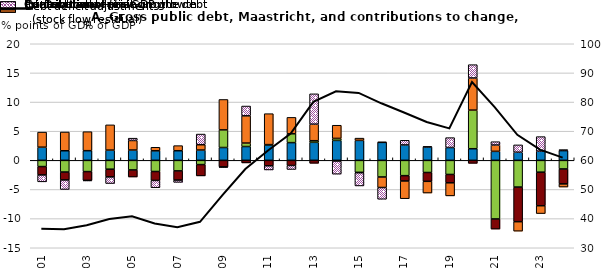
| Category | Interest cost of financing the debt | Contribution of real GDP growth | Contribution of price growth | Primary fiscal deficit | Debt deficit adjustment (stock flow residual) |
|---|---|---|---|---|---|
| 2001-01-01 | 2.254 | -1.07 | -1.44 | 2.589 | -1.182 |
| 2002-01-01 | 1.64 | -2.014 | -1.354 | 3.222 | -1.635 |
| 2003-01-01 | 1.653 | -1.932 | -1.504 | 3.261 | -0.094 |
| 2004-01-01 | 1.753 | -1.519 | -1.324 | 4.333 | -1.139 |
| 2005-01-01 | 1.766 | -1.65 | -1.206 | 1.639 | 0.396 |
| 2006-01-01 | 1.631 | -1.917 | -1.532 | 0.61 | -1.263 |
| 2007-01-01 | 1.646 | -1.816 | -1.575 | 0.877 | -0.393 |
| 2008-01-01 | 1.766 | -0.729 | -1.94 | 0.91 | 1.829 |
| 2009-01-01 | 2.199 | 3.022 | -1.128 | 5.221 | -0.097 |
| 2010-01-01 | 2.366 | 0.597 | -0.443 | 4.671 | 1.682 |
| 2011-01-01 | 2.645 | 0.049 | -0.936 | 5.31 | -0.715 |
| 2012-01-01 | 3.038 | 1.514 | -0.885 | 2.817 | -0.685 |
| 2013-01-01 | 3.088 | 0.277 | -0.51 | 2.836 | 5.21 |
| 2014-01-01 | 3.416 | 0.346 | -0.121 | 2.259 | -2.253 |
| 2015-01-01 | 3.42 | -2.061 | -0.068 | 0.39 | -2.264 |
| 2016-01-01 | 3.081 | -2.86 | 0.053 | -1.804 | -2.015 |
| 2017-01-01 | 2.643 | -2.628 | -0.917 | -3.039 | 0.796 |
| 2018-01-01 | 2.301 | -2.084 | -1.517 | -2.01 | 0.046 |
| 2019-01-01 | 2.195 | -2.423 | -1.436 | -2.242 | 1.701 |
| 2020-01-01 | 1.991 | 6.626 | -0.517 | 5.509 | 2.285 |
| 2021-01-01 | 1.539 | -10.059 | -1.734 | 1.085 | 0.575 |
| 2022-01-01 | 1.386 | -4.589 | -5.939 | -1.623 | 1.261 |
| 2023-01-01 | 1.568 | -2.031 | -5.758 | -1.347 | 2.499 |
| 2024-01-01 | 1.664 | -1.481 | -2.569 | -0.533 | 0.174 |